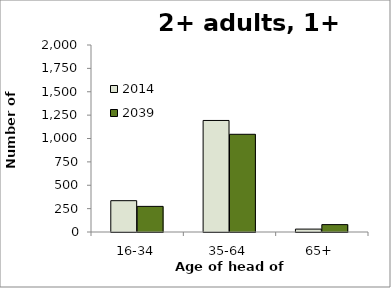
| Category | 2014 | 2039 |
|---|---|---|
| 16-34 | 335 | 274 |
| 35-64 | 1193 | 1045 |
| 65+ | 31 | 79 |